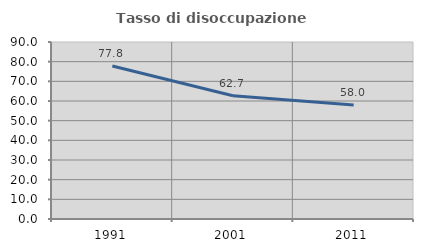
| Category | Tasso di disoccupazione giovanile  |
|---|---|
| 1991.0 | 77.778 |
| 2001.0 | 62.687 |
| 2011.0 | 58.025 |